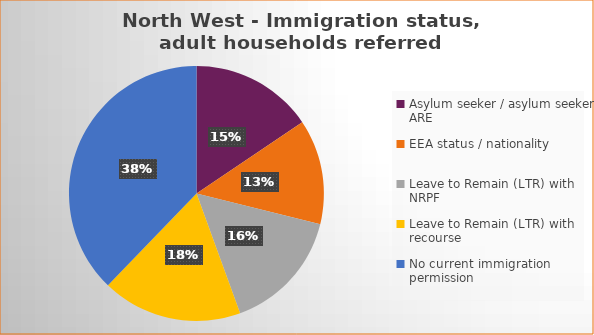
| Category | Number  | Percentage |
|---|---|---|
| Asylum seeker / asylum seeker ARE | 14 | 0.156 |
| EEA status / nationality  | 12 | 0.133 |
| Leave to Remain (LTR) with NRPF | 14 | 0.156 |
| Leave to Remain (LTR) with recourse | 16 | 0.178 |
| No current immigration permission | 34 | 0.378 |